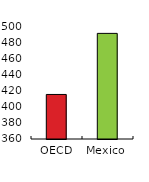
| Category | Overall PISA score |
|---|---|
| OECD | 415.67 |
| Mexico | 492.029 |